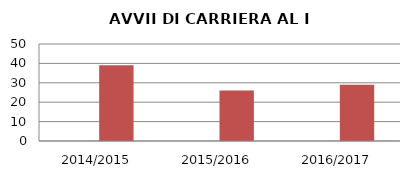
| Category | ANNO | NUMERO |
|---|---|---|
| 2014/2015 | 0 | 39 |
| 2015/2016 | 0 | 26 |
| 2016/2017 | 0 | 29 |